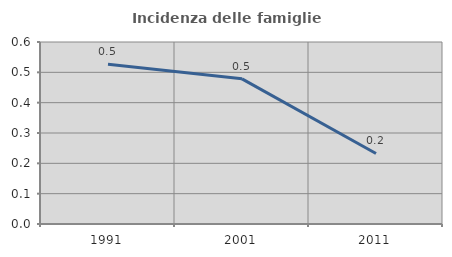
| Category | Incidenza delle famiglie numerose |
|---|---|
| 1991.0 | 0.526 |
| 2001.0 | 0.478 |
| 2011.0 | 0.233 |